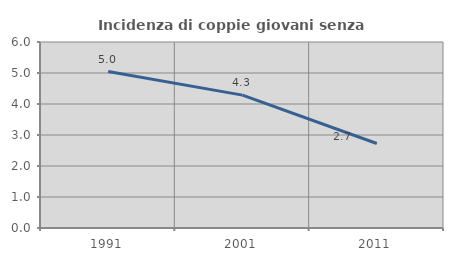
| Category | Incidenza di coppie giovani senza figli |
|---|---|
| 1991.0 | 5.047 |
| 2001.0 | 4.286 |
| 2011.0 | 2.725 |